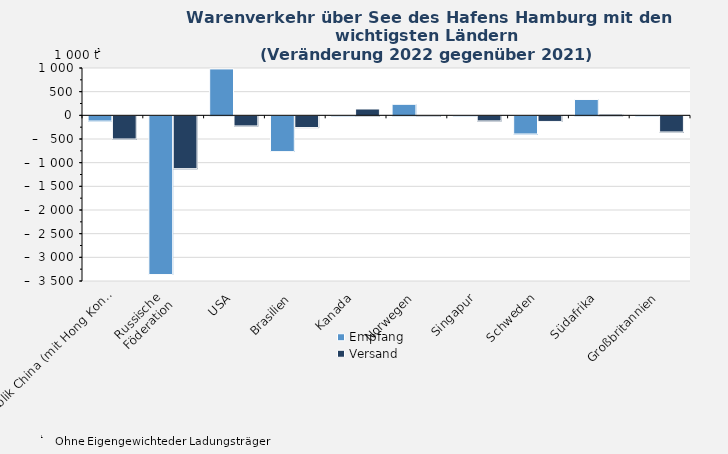
| Category | Empfang | Versand |
|---|---|---|
| Volksrepublik China (mit Hong Kong) | -110.079 | -489.737 |
| Russische 
Föderation | -3352.843 | -1116.236 |
| USA | 980.437 | -213.965 |
| Brasilien | -755.304 | -248.013 |
| Kanada | -3.477 | 133.946 |
| Norwegen | 232.911 | -5.645 |
| Singapur | 5.856 | -107.662 |
| Schweden | -383.625 | -118.493 |
| Südafrika | 335.389 | 25.431 |
| Großbritannien | 14.953 | -340.924 |